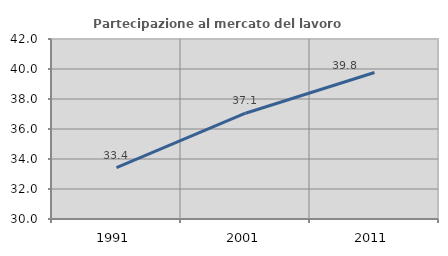
| Category | Partecipazione al mercato del lavoro  femminile |
|---|---|
| 1991.0 | 33.421 |
| 2001.0 | 37.053 |
| 2011.0 | 39.768 |